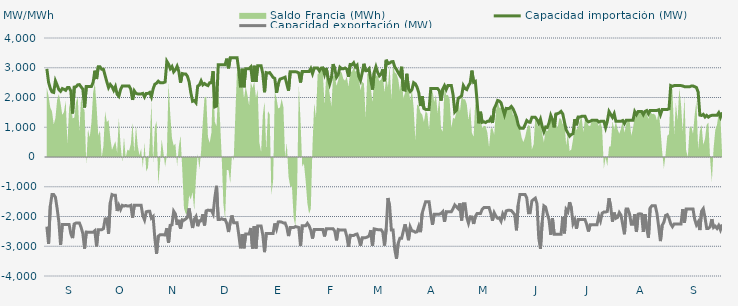
| Category | Capacidad importación (MW) | Capacidad exportación (MW) |
|---|---|---|
| 0 | 2962.5 | -2341.667 |
| 1900-01-01 | 2512.5 | -2920.833 |
| 1900-01-02 | 2308.333 | -1650 |
| 1900-01-03 | 2187.5 | -1262.5 |
| 1900-01-04 | 2170.833 | -1262.5 |
| 1900-01-05 | 2558.333 | -1352.083 |
| 1900-01-06 | 2416.667 | -1731.25 |
| 1900-01-07 | 2266.667 | -2175 |
| 1900-01-08 | 2208.333 | -2956.25 |
| 1900-01-09 | 2300 | -2268.75 |
| 1900-01-10 | 2275 | -2266.667 |
| 1900-01-11 | 2241.667 | -2266.667 |
| 1900-01-12 | 2333.333 | -2266.667 |
| 1900-01-13 | 2333.333 | -2270.833 |
| 1900-01-14 | 2212.5 | -2581.25 |
| 1900-01-15 | 1464.583 | -2725 |
| 1900-01-16 | 2350 | -2250 |
| 1900-01-17 | 2358.333 | -2218.75 |
| 1900-01-18 | 2425 | -2218.75 |
| 1900-01-19 | 2433.333 | -2218.75 |
| 1900-01-20 | 2354.167 | -2368.75 |
| 1900-01-21 | 2279.167 | -2575 |
| 1900-01-22 | 1662.5 | -3079.167 |
| 1900-01-23 | 2366.667 | -2522.917 |
| 1900-01-24 | 2366.667 | -2527.083 |
| 1900-01-25 | 2366.667 | -2527.083 |
| 1900-01-26 | 2366.667 | -2527.083 |
| 1900-01-27 | 2508.333 | -2527.083 |
| 1900-01-28 | 2900 | -2477.083 |
| 1900-01-29 | 2620.833 | -3004.167 |
| 1900-01-30 | 3033.333 | -2443.75 |
| 1900-01-31 | 3033.333 | -2443.75 |
| 1900-02-01 | 2950 | -2443.75 |
| 1900-02-02 | 2950 | -2410.417 |
| 1900-02-03 | 2735.417 | -2081.25 |
| 1900-02-04 | 2525 | -2075 |
| 1900-02-05 | 2332.667 | -2579.167 |
| 1900-02-06 | 2437.5 | -1537.5 |
| 1900-02-07 | 2366.667 | -1262.5 |
| 1900-02-08 | 2241.667 | -1287.5 |
| 1900-02-09 | 2366.667 | -1287.5 |
| 1900-02-10 | 2108.333 | -1814.583 |
| 1900-02-11 | 2039.583 | -1625 |
| 1900-02-12 | 2264.583 | -1762.5 |
| 1900-02-13 | 2383.333 | -1625 |
| 1900-02-14 | 2383.333 | -1650 |
| 1900-02-15 | 2383.333 | -1629.167 |
| 1900-02-16 | 2383.333 | -1650 |
| 1900-02-17 | 2383.333 | -1650 |
| 1900-02-18 | 2275 | -1625 |
| 1900-02-19 | 1918.75 | -2037.5 |
| 1900-02-20 | 2225 | -1625 |
| 1900-02-21 | 2138.417 | -1625 |
| 1900-02-22 | 2120.833 | -1625 |
| 1900-02-23 | 2120.833 | -1625 |
| 1900-02-24 | 2120.833 | -1625 |
| 1900-02-25 | 2137.5 | -1975 |
| 1900-02-26 | 2020 | -2116 |
| 1900-02-27 | 2137.5 | -1841.667 |
| 1900-02-28 | 2137.5 | -1825 |
| 1900-02-28 | 2170.833 | -1825 |
| 1900-03-01 | 2022.917 | -2054.167 |
| 1900-03-02 | 2287.5 | -2000 |
| 1900-03-03 | 2445.833 | -2731.25 |
| 1900-03-04 | 2481.25 | -3254.167 |
| 1900-03-05 | 2547.917 | -2662.5 |
| 1900-03-06 | 2500 | -2616.667 |
| 1900-03-07 | 2500 | -2616.667 |
| 1900-03-08 | 2500 | -2616.667 |
| 1900-03-09 | 2520.833 | -2620.833 |
| 1900-03-10 | 3218.75 | -2393.75 |
| 1900-03-11 | 3120.833 | -2885.417 |
| 1900-03-12 | 2966.667 | -2295.833 |
| 1900-03-13 | 3041.667 | -2281.25 |
| 1900-03-14 | 2862.5 | -1822.917 |
| 1900-03-15 | 2933.333 | -1914.583 |
| 1900-03-16 | 3050 | -2281.25 |
| 1900-03-17 | 2875 | -2112.5 |
| 1900-03-18 | 2500 | -2410.417 |
| 1900-03-19 | 2804.167 | -2112.5 |
| 1900-03-20 | 2791.667 | -2125 |
| 1900-03-21 | 2791.667 | -2083.333 |
| 1900-03-22 | 2716.667 | -2031.25 |
| 1900-03-23 | 2529.167 | -1727.083 |
| 1900-03-24 | 2162.5 | -2085.417 |
| 1900-03-25 | 1872.917 | -2385.417 |
| 1900-03-26 | 1897.917 | -2095.833 |
| 1900-03-27 | 1825 | -2002.083 |
| 1900-03-28 | 2383.333 | -2325 |
| 1900-03-29 | 2418.75 | -2145.833 |
| 1900-03-30 | 2558.333 | -2145.833 |
| 1900-03-31 | 2425 | -1925 |
| 1900-04-01 | 2470.833 | -2300 |
| 1900-04-02 | 2425 | -1808.333 |
| 1900-04-03 | 2400 | -1785.417 |
| 1900-04-04 | 2495.833 | -1795.833 |
| 1900-04-05 | 2497.917 | -1789.583 |
| 1900-04-06 | 2882.917 | -1912.5 |
| 1900-04-07 | 1685.417 | -1368.75 |
| 1900-04-08 | 1712.5 | -968.75 |
| 1900-04-09 | 3104.167 | -2100 |
| 1900-04-10 | 3104.167 | -2100 |
| 1900-04-11 | 3104.167 | -2075 |
| 1900-04-12 | 3104.167 | -2100 |
| 1900-04-13 | 3104.167 | -2100 |
| 1900-04-14 | 3306.25 | -2237.5 |
| 1900-04-15 | 2981.25 | -2520.833 |
| 1900-04-16 | 3333.333 | -2189.583 |
| 1900-04-17 | 3333.333 | -1964.583 |
| 1900-04-18 | 3333.333 | -2212.5 |
| 1900-04-19 | 3333.333 | -2212.5 |
| 1900-04-20 | 3333.333 | -2212.5 |
| 1900-04-21 | 2904.167 | -2625 |
| 1900-04-22 | 2343.75 | -3068.75 |
| 1900-04-23 | 2966.667 | -2589.583 |
| 1900-04-24 | 2343.75 | -3068.75 |
| 1900-04-25 | 2966.667 | -2589.583 |
| 1900-04-26 | 2966.667 | -2589.583 |
| 1900-04-27 | 2966.667 | -2589.583 |
| 1900-04-28 | 3025 | -2385.417 |
| 1900-04-29 | 2525 | -3075 |
| 1900-04-30 | 3066.667 | -2320.833 |
| 1900-05-01 | 2525 | -3075 |
| 1900-05-02 | 3066.667 | -2320.833 |
| 1900-05-03 | 3066.667 | -2320.833 |
| 1900-05-04 | 3066.667 | -2320.833 |
| 1900-05-05 | 2800 | -2622.917 |
| 1900-05-06 | 2177.083 | -3197.917 |
| 1900-05-07 | 2837.5 | -2568.75 |
| 1900-05-08 | 2820.833 | -2568.75 |
| 1900-05-09 | 2837.5 | -2568.75 |
| 1900-05-10 | 2758.333 | -2568.75 |
| 1900-05-11 | 2675 | -2568.75 |
| 1900-05-12 | 2641.667 | -2233.333 |
| 1900-05-13 | 2156.25 | -2418.75 |
| 1900-05-14 | 2450 | -2181.25 |
| 1900-05-15 | 2616.667 | -2179.167 |
| 1900-05-16 | 2637.5 | -2187.5 |
| 1900-05-17 | 2658.333 | -2216.667 |
| 1900-05-18 | 2683.333 | -2216.667 |
| 1900-05-19 | 2450 | -2362.5 |
| 1900-05-20 | 2231.25 | -2658.333 |
| 1900-05-21 | 2866.667 | -2372.917 |
| 1900-05-22 | 2866.667 | -2372.917 |
| 1900-05-23 | 2866.667 | -2372.917 |
| 1900-05-24 | 2866.667 | -2339.583 |
| 1900-05-25 | 2854.167 | -2352.083 |
| 1900-05-26 | 2825 | -2368.75 |
| 1900-05-27 | 2504.167 | -2991.667 |
| 1900-05-28 | 2875 | -2314.583 |
| 1900-05-29 | 2875 | -2314.583 |
| 1900-05-30 | 2875 | -2314.583 |
| 1900-05-31 | 2875 | -2231.25 |
| 1900-06-01 | 2875 | -2314.583 |
| 1900-06-02 | 2975 | -2462.5 |
| 1900-06-03 | 2802.083 | -2741.667 |
| 1900-06-04 | 2987.5 | -2433.333 |
| 1900-06-05 | 2987.5 | -2433.333 |
| 1900-06-06 | 2987.5 | -2433.333 |
| 1900-06-07 | 2893.75 | -2433.333 |
| 1900-06-08 | 2987.5 | -2433.333 |
| 1900-06-09 | 2995.833 | -2437.5 |
| 1900-06-10 | 2781.25 | -2670.833 |
| 1900-06-11 | 2993.75 | -2412.5 |
| 1900-06-12 | 2679.167 | -2412.5 |
| 1900-06-13 | 2450 | -2412.5 |
| 1900-06-14 | 2645.833 | -2412.5 |
| 1900-06-15 | 3120.833 | -2412.5 |
| 1900-06-16 | 2958.333 | -2495.833 |
| 1900-06-17 | 2681.25 | -2802.083 |
| 1900-06-18 | 2768.75 | -2439.583 |
| 1900-06-19 | 3016.667 | -2456.25 |
| 1900-06-20 | 2966.667 | -2454.167 |
| 1900-06-21 | 2966.667 | -2452.083 |
| 1900-06-22 | 2991.667 | -2454.167 |
| 1900-06-23 | 2952.083 | -2670.833 |
| 1900-06-24 | 2697.917 | -3016.667 |
| 1900-06-25 | 3108.333 | -2631.25 |
| 1900-06-26 | 3100 | -2637.5 |
| 1900-06-27 | 3166.667 | -2637.5 |
| 1900-06-28 | 3025 | -2604.167 |
| 1900-06-29 | 3083.333 | -2589.583 |
| 1900-06-30 | 2708.333 | -2743.75 |
| 1900-07-01 | 2570.833 | -2979.167 |
| 1900-07-02 | 2833.333 | -2716.667 |
| 1900-07-03 | 3133.333 | -2716.667 |
| 1900-07-04 | 2900 | -2710.417 |
| 1900-07-05 | 2904.167 | -2689.583 |
| 1900-07-06 | 2966.667 | -2654.167 |
| 1900-07-07 | 2587.5 | -2462.5 |
| 1900-07-08 | 2266.667 | -2977.083 |
| 1900-07-09 | 2845.833 | -2416.667 |
| 1900-07-10 | 3033.333 | -2429.167 |
| 1900-07-11 | 2845.833 | -2441.667 |
| 1900-07-12 | 2725 | -2441.667 |
| 1900-07-13 | 2783.333 | -2441.667 |
| 1900-07-14 | 2943.75 | -2529.167 |
| 1900-07-15 | 2545.833 | -2975 |
| 1900-07-16 | 3266.667 | -2410.417 |
| 1900-07-17 | 3137.5 | -1379.167 |
| 1900-07-18 | 3158.333 | -1654.167 |
| 1900-07-19 | 3200 | -2454.167 |
| 1900-07-20 | 3208.333 | -2456.25 |
| 1900-07-21 | 3025 | -3112.5 |
| 1900-07-22 | 2943.75 | -3418.75 |
| 1900-07-23 | 2835.417 | -2900 |
| 1900-07-24 | 2741.667 | -2729.167 |
| 1900-07-25 | 3033.333 | -2729.167 |
| 1900-07-26 | 2262.5 | -2487.5 |
| 1900-07-27 | 2245.833 | -2262.5 |
| 1900-07-28 | 2797.917 | -2500 |
| 1900-07-29 | 2295.652 | -2797.826 |
| 1900-07-30 | 2200 | -2350 |
| 1900-07-31 | 2262.5 | -2481.25 |
| 1900-08-01 | 2500 | -2491.667 |
| 1900-08-02 | 2458.333 | -2529.167 |
| 1900-08-03 | 2341.667 | -2512.5 |
| 1900-08-04 | 2162.5 | -2331.25 |
| 1900-08-05 | 1712.5 | -2525 |
| 1900-08-06 | 2043.75 | -1885.417 |
| 1900-08-07 | 1629.167 | -1687.5 |
| 1900-08-08 | 1600 | -1500 |
| 1900-08-09 | 1600 | -1500 |
| 1900-08-10 | 1600 | -1500 |
| 1900-08-11 | 2300 | -1937.5 |
| 1900-08-12 | 2300 | -2281.25 |
| 1900-08-13 | 2300 | -1920.833 |
| 1900-08-14 | 2300 | -1920.833 |
| 1900-08-15 | 2300 | -1920.833 |
| 1900-08-16 | 2225 | -1920.833 |
| 1900-08-17 | 1896.083 | -1898.167 |
| 1900-08-18 | 2287.5 | -1837.5 |
| 1900-08-19 | 2400 | -2181.25 |
| 1900-08-20 | 2266.667 | -1837.5 |
| 1900-08-21 | 2400 | -1841.667 |
| 1900-08-22 | 2400 | -1841.667 |
| 1900-08-23 | 2400 | -1841.667 |
| 1900-08-24 | 2100 | -1737.5 |
| 1900-08-25 | 1512.5 | -1612.5 |
| 1900-08-26 | 1575 | -1675 |
| 1900-08-27 | 1975 | -1737.5 |
| 1900-08-28 | 2008.333 | -1560.417 |
| 1900-08-29 | 2056.25 | -2133.333 |
| 1900-08-30 | 2400 | -1570.833 |
| 1900-08-31 | 2300 | -1570.833 |
| 1900-09-01 | 2266.667 | -2031.25 |
| 1900-09-02 | 2400 | -2225 |
| 1900-09-03 | 2487.5 | -2010.417 |
| 1900-09-04 | 2904.167 | -2016.667 |
| 1900-09-05 | 2512.5 | -2250 |
| 1900-09-06 | 2541.667 | -2000 |
| 1900-09-07 | 1884.392 | -1900 |
| 1900-09-08 | 1133.333 | -1900 |
| 1900-09-09 | 1520.875 | -1900 |
| 1900-09-10 | 1166.667 | -1758.333 |
| 1900-09-11 | 1183.333 | -1700 |
| 1900-09-12 | 1158.333 | -1700 |
| 1900-09-13 | 1200 | -1700 |
| 1900-09-14 | 1200 | -1700 |
| 1900-09-15 | 1304.583 | -1887.5 |
| 1900-09-16 | 1145.417 | -2139.583 |
| 1900-09-17 | 1629.167 | -1875 |
| 1900-09-18 | 1750 | -1987.5 |
| 1900-09-19 | 1900 | -2058.333 |
| 1900-09-20 | 1879.167 | -2050 |
| 1900-09-21 | 1820.833 | -2156.25 |
| 1900-09-22 | 1616.667 | -1912.5 |
| 1900-09-23 | 1420.833 | -2027.083 |
| 1900-09-24 | 1633.333 | -1812.5 |
| 1900-09-25 | 1625 | -1791.667 |
| 1900-09-26 | 1637.5 | -1791.667 |
| 1900-09-27 | 1700 | -1800 |
| 1900-09-28 | 1620.833 | -1868.75 |
| 1900-09-29 | 1487.5 | -1937.5 |
| 1900-09-30 | 1337.5 | -2464.583 |
| 1900-10-01 | 1083.333 | -1610.417 |
| 1900-10-02 | 966.667 | -1258.333 |
| 1900-10-03 | 966.667 | -1258.333 |
| 1900-10-04 | 966.667 | -1258.333 |
| 1900-10-05 | 1083.333 | -1258.333 |
| 1900-10-06 | 1225 | -1375 |
| 1900-10-07 | 1175 | -1875 |
| 1900-10-08 | 1166.667 | -1875 |
| 1900-10-09 | 1333.333 | -1475 |
| 1900-10-10 | 1333.333 | -1425 |
| 1900-10-11 | 1333.333 | -1383.333 |
| 1900-10-12 | 1254.167 | -1577.083 |
| 1900-10-13 | 1133.333 | -2725 |
| 1900-10-14 | 1275 | -3081.25 |
| 1900-10-15 | 1029.167 | -2189.583 |
| 1900-10-16 | 850 | -1641.667 |
| 1900-10-17 | 1008.333 | -1683.333 |
| 1900-10-18 | 991.667 | -1916.667 |
| 1900-10-19 | 1150 | -2114.583 |
| 1900-10-20 | 1400 | -2612.5 |
| 1900-10-21 | 1262.5 | -2058.333 |
| 1900-10-22 | 995.833 | -2600 |
| 1900-10-23 | 1445.833 | -2600 |
| 1900-10-24 | 1458.333 | -2600 |
| 1900-10-25 | 1483.333 | -2600 |
| 1900-10-26 | 1533.333 | -2600 |
| 1900-10-27 | 1450 | -2012.5 |
| 1900-10-28 | 1175 | -2566.667 |
| 1900-10-29 | 912.5 | -1762.5 |
| 1900-10-30 | 806.25 | -1841.667 |
| 1900-10-31 | 700 | -1520.833 |
| 1900-11-01 | 756.25 | -1710.417 |
| 1900-11-02 | 783.333 | -2239.583 |
| 1900-11-03 | 1270.833 | -2112.5 |
| 1900-11-04 | 1066.667 | -2410.417 |
| 1900-11-05 | 1345.833 | -2104.167 |
| 1900-11-06 | 1341.667 | -2104.167 |
| 1900-11-07 | 1366.667 | -2104.167 |
| 1900-11-08 | 1366.667 | -2104.167 |
| 1900-11-09 | 1366.667 | -2104.167 |
| 1900-11-10 | 1231.25 | -2275 |
| 1900-11-11 | 1181.25 | -2504.167 |
| 1900-11-12 | 1200 | -2275 |
| 1900-11-13 | 1233.333 | -2275 |
| 1900-11-14 | 1233.333 | -2275 |
| 1900-11-15 | 1233.333 | -2275 |
| 1900-11-16 | 1233.333 | -2275 |
| 1900-11-17 | 1175 | -1987.5 |
| 1900-11-18 | 1200 | -2147.917 |
| 1900-11-19 | 1200 | -1887.5 |
| 1900-11-20 | 1200 | -1850 |
| 1900-11-21 | 987.5 | -1850 |
| 1900-11-22 | 1200 | -1831.25 |
| 1900-11-23 | 1529.167 | -1387.5 |
| 1900-11-24 | 1427.083 | -1679.167 |
| 1900-11-25 | 1331.25 | -2172.917 |
| 1900-11-26 | 1456.25 | -1868.75 |
| 1900-11-27 | 1200 | -2060.417 |
| 1900-11-28 | 1200 | -2029.167 |
| 1900-11-29 | 1200 | -1868.75 |
| 1900-11-30 | 1200 | -1958.333 |
| 1900-12-01 | 1225 | -2275 |
| 1900-12-02 | 1125 | -2595.833 |
| 1900-12-03 | 1233.333 | -1750 |
| 1900-12-04 | 1233.333 | -1750 |
| 1900-12-05 | 1233.333 | -1925 |
| 1900-12-06 | 1233.333 | -2262.5 |
| 1900-12-07 | 1233.333 | -2262.5 |
| 1900-12-08 | 1525 | -1925 |
| 1900-12-09 | 1425 | -2520.833 |
| 1900-12-10 | 1533.333 | -1920.833 |
| 1900-12-11 | 1533.333 | -1908.333 |
| 1900-12-12 | 1533.333 | -1920.833 |
| 1900-12-13 | 1425 | -2520.833 |
| 1900-12-14 | 1533.333 | -1920.833 |
| 1900-12-15 | 1562.5 | -2412.5 |
| 1900-12-16 | 1454.167 | -2710.417 |
| 1900-12-17 | 1566.667 | -1712.5 |
| 1900-12-18 | 1566.667 | -1641.667 |
| 1900-12-19 | 1566.667 | -1641.667 |
| 1900-12-20 | 1566.667 | -1641.667 |
| 1900-12-21 | 1566.667 | -1904.167 |
| 1900-12-22 | 1587.5 | -2362.5 |
| 1900-12-23 | 1418.75 | -2827.083 |
| 1900-12-24 | 1595.833 | -2297.917 |
| 1900-12-25 | 1595.833 | -2193.75 |
| 1900-12-26 | 1595.833 | -1964.583 |
| 1900-12-27 | 1595.833 | -1937.5 |
| 1900-12-28 | 1618.75 | -2058.333 |
| 1900-12-29 | 2400 | -2250 |
| 1900-12-30 | 2375 | -2341.667 |
| 1900-12-31 | 2400 | -2250 |
| 1901-01-01 | 2400 | -2250 |
| 1901-01-02 | 2400 | -2250 |
| 1901-01-03 | 2400 | -2250 |
| 1901-01-04 | 2400 | -2250 |
| 1901-01-05 | 2387.5 | -1750 |
| 1901-01-06 | 2364.583 | -2208.333 |
| 1901-01-07 | 2364.583 | -1745.833 |
| 1901-01-08 | 2360.417 | -1745.833 |
| 1901-01-09 | 2358.333 | -1745.833 |
| 1901-01-10 | 2387.5 | -1745.833 |
| 1901-01-11 | 2387.5 | -1745.833 |
| 1901-01-12 | 2362.5 | -2100 |
| 1901-01-13 | 2335.417 | -2283.333 |
| 1901-01-14 | 2181.25 | -2187.5 |
| 1901-01-15 | 1408.333 | -2456.25 |
| 1901-01-16 | 1395.833 | -1820.833 |
| 1901-01-17 | 1433.333 | -1737.5 |
| 1901-01-18 | 1345.833 | -2037.5 |
| 1901-01-19 | 1400 | -2400 |
| 1901-01-20 | 1341.667 | -2400 |
| 1901-01-21 | 1383.333 | -2345.833 |
| 1901-01-22 | 1400 | -2087.5 |
| 1901-01-23 | 1400 | -2370.833 |
| 1901-01-24 | 1400 | -2327.083 |
| 1901-01-25 | 1400 | -2400 |
| 1901-01-26 | 1487.5 | -2300 |
| 1901-01-27 | 1337.5 | -2445.833 |
| 1901-01-28 | 1500 | -2266.667 |